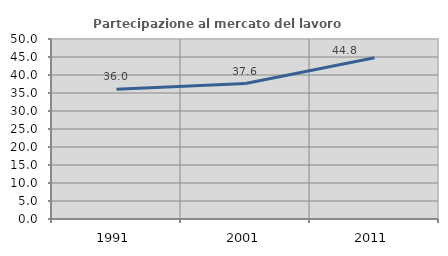
| Category | Partecipazione al mercato del lavoro  femminile |
|---|---|
| 1991.0 | 36.025 |
| 2001.0 | 37.624 |
| 2011.0 | 44.79 |